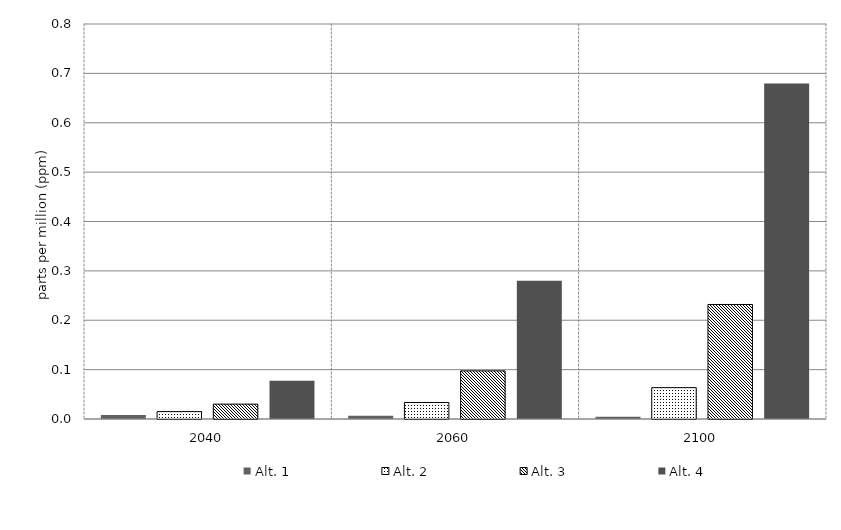
| Category | Alt. 1 | Alt. 2 | Alt. 3 | Alt. 4 | Alt 5 | Alt 6 | Alt 7 | Alt 8 | Alt 10 |
|---|---|---|---|---|---|---|---|---|---|
| 2040.0 | 0.008 | 0.015 | 0.03 | 0.077 |  |  |  |  |  |
| 2060.0 | 0.006 | 0.033 | 0.097 | 0.28 |  |  |  |  |  |
| 2100.0 | 0.004 | 0.063 | 0.232 | 0.679 |  |  |  |  |  |